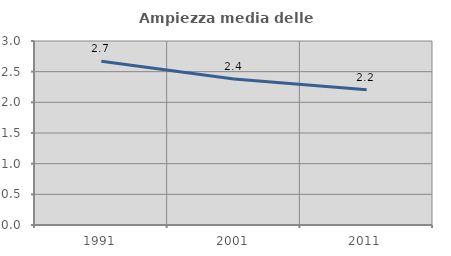
| Category | Ampiezza media delle famiglie |
|---|---|
| 1991.0 | 2.671 |
| 2001.0 | 2.381 |
| 2011.0 | 2.205 |